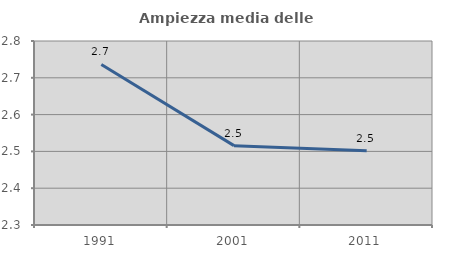
| Category | Ampiezza media delle famiglie |
|---|---|
| 1991.0 | 2.736 |
| 2001.0 | 2.516 |
| 2011.0 | 2.502 |